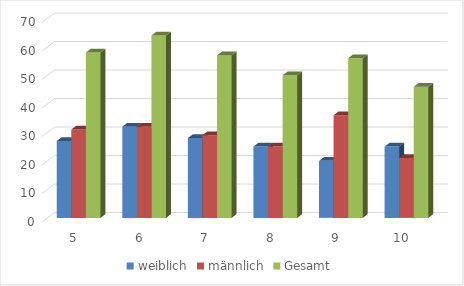
| Category | weiblich | männlich | Gesamt |
|---|---|---|---|
| 5.0 | 27 | 31 | 58 |
| 6.0 | 32 | 32 | 64 |
| 7.0 | 28 | 29 | 57 |
| 8.0 | 25 | 25 | 50 |
| 9.0 | 20 | 36 | 56 |
| 10.0 | 25 | 21 | 46 |